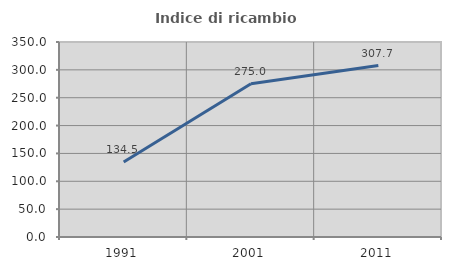
| Category | Indice di ricambio occupazionale  |
|---|---|
| 1991.0 | 134.545 |
| 2001.0 | 275 |
| 2011.0 | 307.692 |